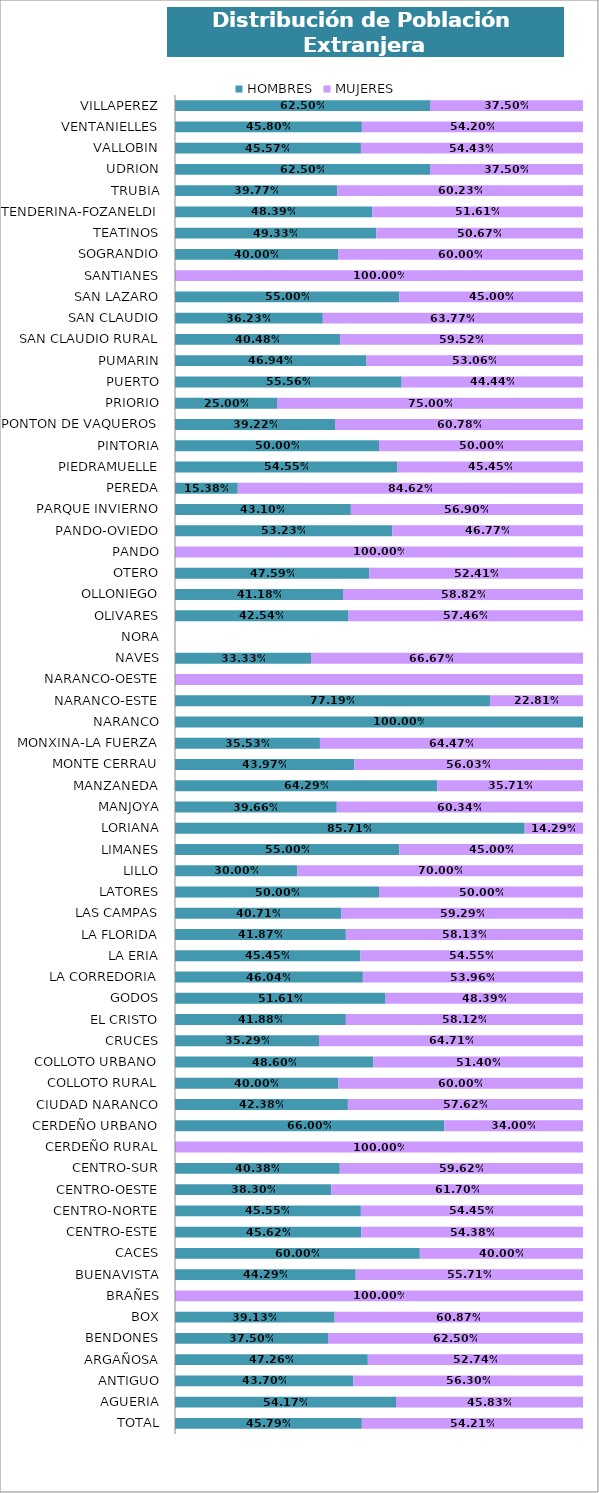
| Category | HOMBRES | MUJERES |
|---|---|---|
| TOTAL | 0.458 | 0.542 |
| AGUERIA | 0.542 | 0.458 |
| ANTIGUO | 0.437 | 0.563 |
| ARGAÑOSA | 0.473 | 0.527 |
| BENDONES | 0.375 | 0.625 |
| BOX | 0.391 | 0.609 |
| BRAÑES | 0 | 1 |
| BUENAVISTA | 0.443 | 0.557 |
| CACES | 0.6 | 0.4 |
| CENTRO-ESTE | 0.456 | 0.544 |
| CENTRO-NORTE | 0.456 | 0.544 |
| CENTRO-OESTE | 0.383 | 0.617 |
| CENTRO-SUR | 0.404 | 0.596 |
| CERDEÑO RURAL | 0 | 1 |
| CERDEÑO URBANO | 0.66 | 0.34 |
| CIUDAD NARANCO | 0.424 | 0.576 |
| COLLOTO RURAL | 0.4 | 0.6 |
| COLLOTO URBANO | 0.486 | 0.514 |
| CRUCES | 0.353 | 0.647 |
| EL CRISTO | 0.419 | 0.581 |
| GODOS | 0.516 | 0.484 |
| LA CORREDORIA | 0.46 | 0.54 |
| LA ERIA | 0.455 | 0.545 |
| LA FLORIDA | 0.419 | 0.581 |
| LAS CAMPAS | 0.407 | 0.593 |
| LATORES | 0.5 | 0.5 |
| LILLO | 0.3 | 0.7 |
| LIMANES | 0.55 | 0.45 |
| LORIANA | 0.857 | 0.143 |
| MANJOYA | 0.397 | 0.603 |
| MANZANEDA | 0.643 | 0.357 |
| MONTE CERRAU | 0.44 | 0.56 |
| MONXINA-LA FUERZA | 0.355 | 0.645 |
| NARANCO | 1 | 0 |
| NARANCO-ESTE | 0.772 | 0.228 |
| NARANCO-OESTE | 0 | 1 |
| NAVES | 0.333 | 0.667 |
| NORA | 0 | 0 |
| OLIVARES | 0.425 | 0.575 |
| OLLONIEGO | 0.412 | 0.588 |
| OTERO | 0.476 | 0.524 |
| PANDO | 0 | 1 |
| PANDO-OVIEDO | 0.532 | 0.468 |
| PARQUE INVIERNO | 0.431 | 0.569 |
| PEREDA | 0.154 | 0.846 |
| PIEDRAMUELLE | 0.545 | 0.455 |
| PINTORIA | 0.5 | 0.5 |
| PONTON DE VAQUEROS | 0.392 | 0.608 |
| PRIORIO | 0.25 | 0.75 |
| PUERTO | 0.556 | 0.444 |
| PUMARIN | 0.469 | 0.531 |
| SAN CLAUDIO RURAL | 0.405 | 0.595 |
| SAN CLAUDIO | 0.362 | 0.638 |
| SAN LAZARO | 0.55 | 0.45 |
| SANTIANES | 0 | 1 |
| SOGRANDIO | 0.4 | 0.6 |
| TEATINOS | 0.493 | 0.507 |
| TENDERINA-FOZANELDI | 0.484 | 0.516 |
| TRUBIA | 0.398 | 0.602 |
| UDRION | 0.625 | 0.375 |
| VALLOBIN | 0.456 | 0.544 |
| VENTANIELLES | 0.458 | 0.542 |
| VILLAPEREZ | 0.625 | 0.375 |